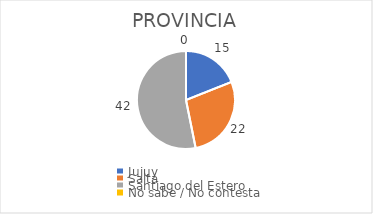
| Category | PROVINCIA: |
|---|---|
| Jujuy  | 0.19 |
| Salta  | 0.278 |
| Santiago del Estero  | 0.532 |
| No sabe / No contesta | 0 |